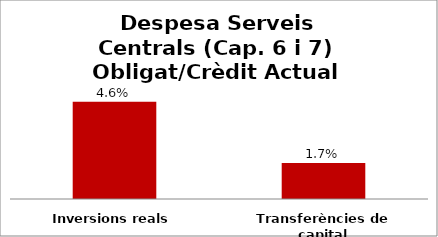
| Category | Series 0 |
|---|---|
| Inversions reals | 0.046 |
| Transferències de capital | 0.017 |